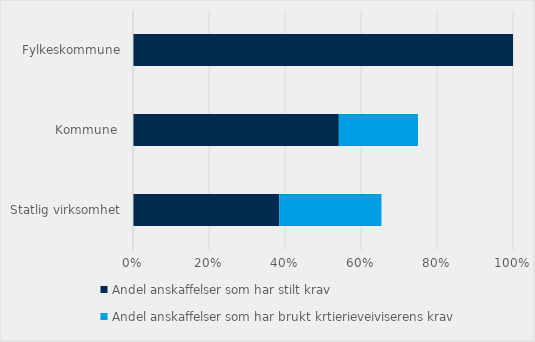
| Category | Andel anskaffelser som har stilt krav | Andel anskaffelser som har brukt krtierieveiviserens krav |
|---|---|---|
| Statlig virksomhet | 0.385 | 0.269 |
| Kommune  | 0.542 | 0.208 |
| Fylkeskommune | 1 | 0 |